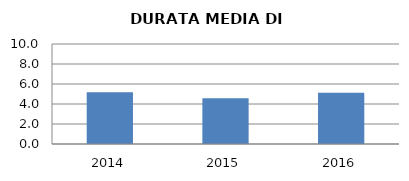
| Category | 2014 2015 2016 |
|---|---|
| 2014.0 | 5.175 |
| 2015.0 | 4.568 |
| 2016.0 | 5.121 |